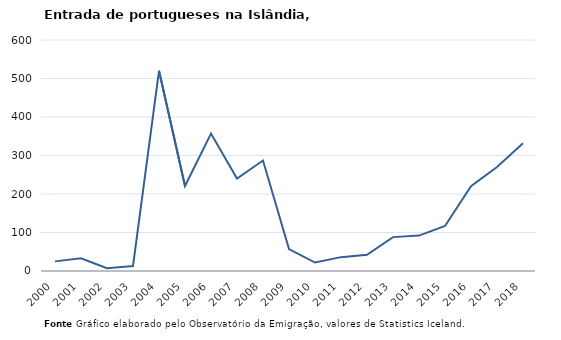
| Category | Entradas |
|---|---|
| 2000.0 | 25 |
| 2001.0 | 33 |
| 2002.0 | 7 |
| 2003.0 | 13 |
| 2004.0 | 520 |
| 2005.0 | 221 |
| 2006.0 | 357 |
| 2007.0 | 240 |
| 2008.0 | 287 |
| 2009.0 | 57 |
| 2010.0 | 22 |
| 2011.0 | 36 |
| 2012.0 | 42 |
| 2013.0 | 88 |
| 2014.0 | 92 |
| 2015.0 | 117 |
| 2016.0 | 220 |
| 2017.0 | 270 |
| 2018.0 | 332 |